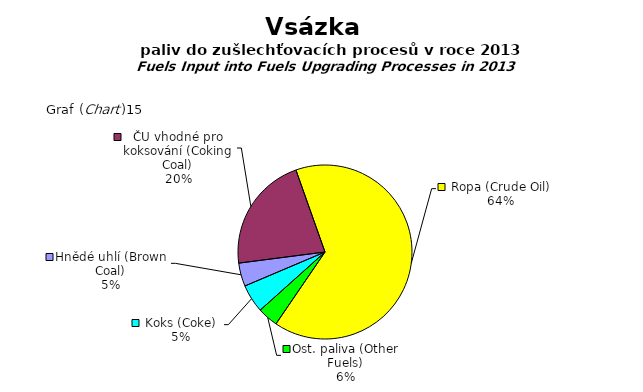
| Category | Series 0 |
|---|---|
| Hnědé uhlí (Brown Coal) | 18838246 |
| ČU vhodné pro koksování (Coking Coal) | 93805172 |
| Ropa (Crude Oil) | 281730066.484 |
| Ost. paliva (Other Fuels) | 16637257.295 |
| Koks (Coke) | 22767184 |